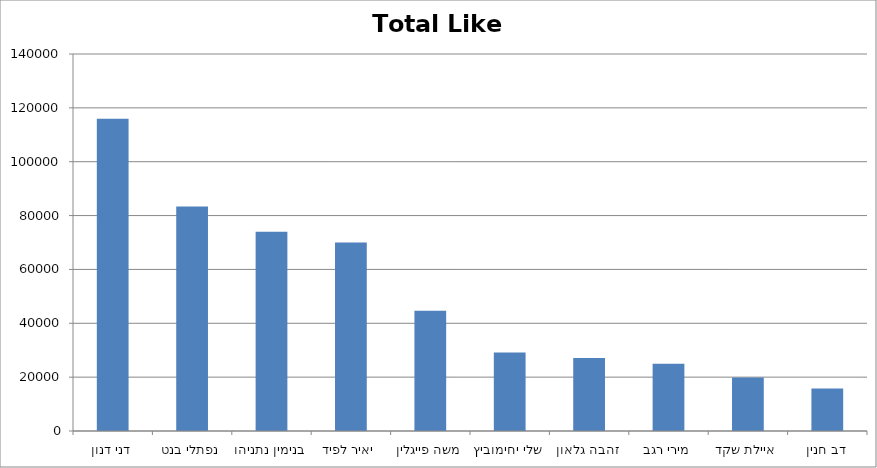
| Category | Total Like  |
|---|---|
| דני דנון | 115992 |
| נפתלי בנט | 83399 |
| בנימין נתניהו | 74031 |
| יאיר לפיד | 70018 |
| משה פייגלין | 44650 |
| שלי יחימוביץ | 29113 |
| זהבה גלאון | 27110 |
| מירי רגב | 24976 |
| איילת שקד | 19846 |
| דב חנין | 15748 |